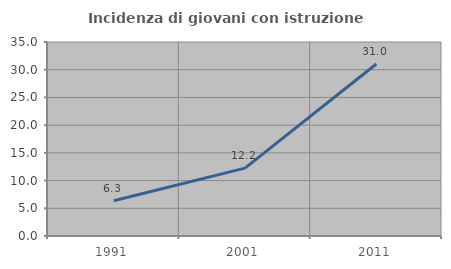
| Category | Incidenza di giovani con istruzione universitaria |
|---|---|
| 1991.0 | 6.349 |
| 2001.0 | 12.245 |
| 2011.0 | 31.034 |